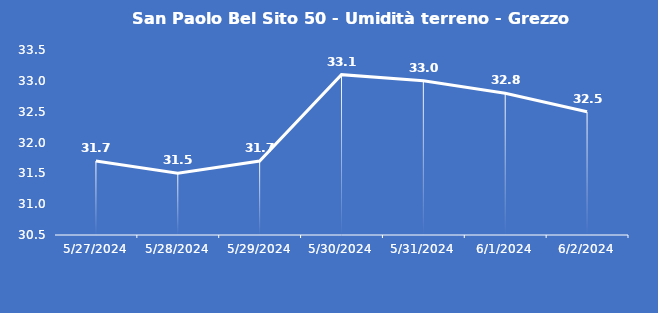
| Category | San Paolo Bel Sito 50 - Umidità terreno - Grezzo (%VWC) |
|---|---|
| 5/27/24 | 31.7 |
| 5/28/24 | 31.5 |
| 5/29/24 | 31.7 |
| 5/30/24 | 33.1 |
| 5/31/24 | 33 |
| 6/1/24 | 32.8 |
| 6/2/24 | 32.5 |